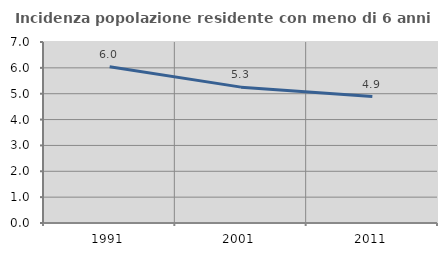
| Category | Incidenza popolazione residente con meno di 6 anni |
|---|---|
| 1991.0 | 6.042 |
| 2001.0 | 5.254 |
| 2011.0 | 4.889 |